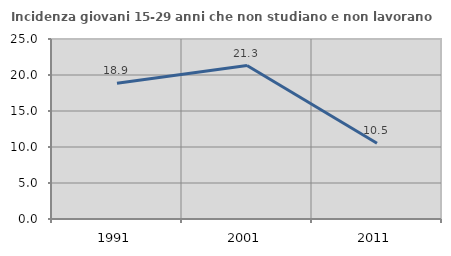
| Category | Incidenza giovani 15-29 anni che non studiano e non lavorano  |
|---|---|
| 1991.0 | 18.868 |
| 2001.0 | 21.311 |
| 2011.0 | 10.526 |